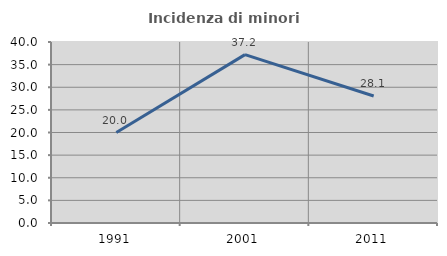
| Category | Incidenza di minori stranieri |
|---|---|
| 1991.0 | 20 |
| 2001.0 | 37.209 |
| 2011.0 | 28.061 |